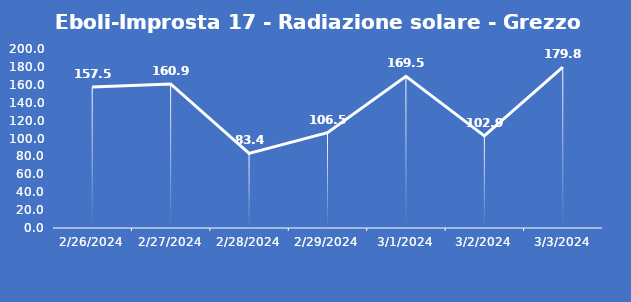
| Category | Eboli-Improsta 17 - Radiazione solare - Grezzo (W/m2) |
|---|---|
| 2/26/24 | 157.5 |
| 2/27/24 | 160.9 |
| 2/28/24 | 83.4 |
| 2/29/24 | 106.5 |
| 3/1/24 | 169.5 |
| 3/2/24 | 102.9 |
| 3/3/24 | 179.8 |